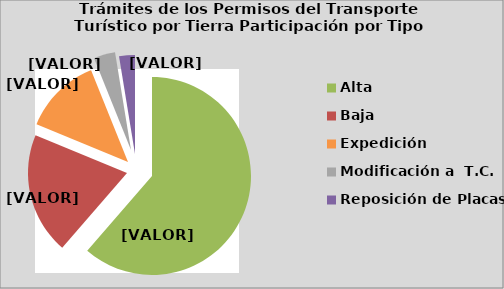
| Category | Series 0 |
|---|---|
| Alta                                         | 61.32 |
| Baja | 19.882 |
| Expedición | 12.663 |
| Modificación a  T.C. | 3.5 |
| Reposición de Placas | 2.579 |